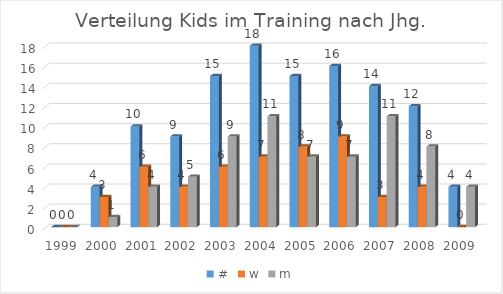
| Category | # | w | m |
|---|---|---|---|
| 1999.0 | 0 | 0 | 0 |
| 2000.0 | 4 | 3 | 1 |
| 2001.0 | 10 | 6 | 4 |
| 2002.0 | 9 | 4 | 5 |
| 2003.0 | 15 | 6 | 9 |
| 2004.0 | 18 | 7 | 11 |
| 2005.0 | 15 | 8 | 7 |
| 2006.0 | 16 | 9 | 7 |
| 2007.0 | 14 | 3 | 11 |
| 2008.0 | 12 | 4 | 8 |
| 2009.0 | 4 | 0 | 4 |